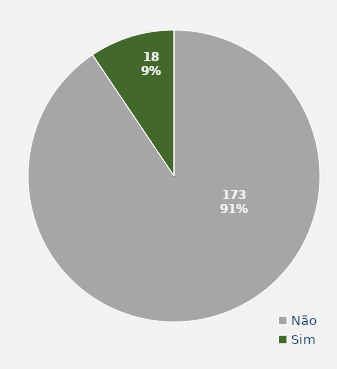
| Category | Total |
|---|---|
| Não | 173 |
| Sim | 18 |